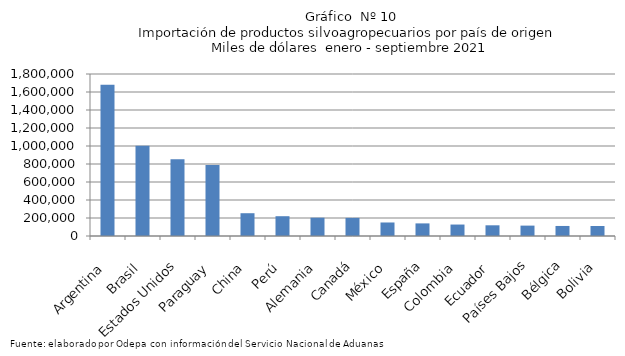
| Category | Series 0 |
|---|---|
| Argentina | 1680961.866 |
| Brasil | 1003832.709 |
| Estados Unidos | 853203.78 |
| Paraguay | 788736.632 |
| China | 253133.966 |
| Perú | 219891.784 |
| Alemania | 203371.84 |
| Canadá | 201290.67 |
| México | 150225.463 |
| España | 140055.361 |
| Colombia | 127305.48 |
| Ecuador | 118898.824 |
| Países Bajos | 115405.097 |
| Bélgica | 111510.613 |
| Bolivia | 111063.073 |